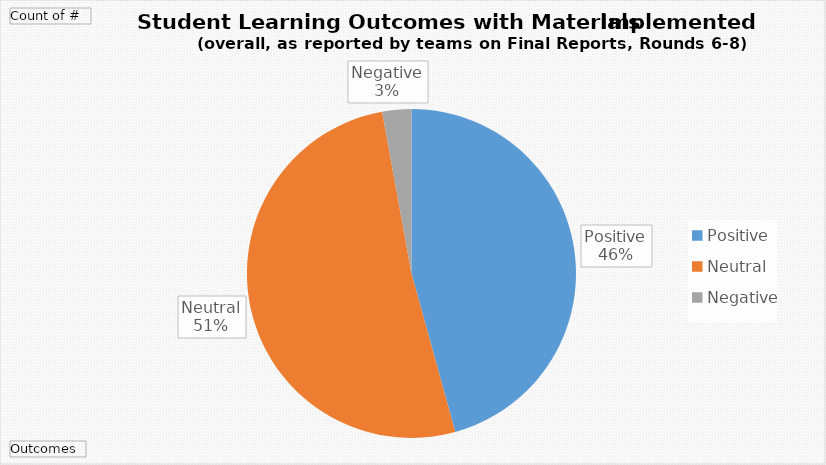
| Category | Total |
|---|---|
| Positive | 16 |
| Neutral | 18 |
| Negative | 1 |